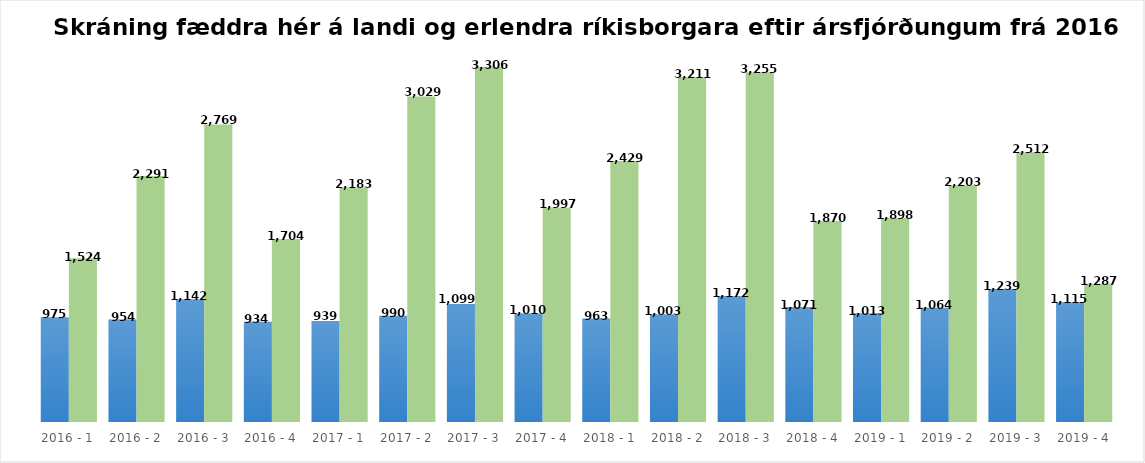
| Category | Skráning fæddra | Skráning erlendra |
|---|---|---|
| 2016 - 1 | 975 | 1524 |
| 2016 - 2 | 954 | 2291 |
| 2016 - 3 | 1142 | 2769 |
| 2016 - 4 | 934 | 1704 |
| 2017 - 1 | 939 | 2183 |
| 2017 - 2 | 990 | 3029 |
| 2017 - 3 | 1099 | 3306 |
| 2017 - 4 | 1010 | 1997 |
| 2018 - 1 | 963 | 2429 |
| 2018 - 2 | 1003 | 3211 |
| 2018 - 3 | 1172 | 3255 |
| 2018 - 4 | 1071 | 1870 |
| 2019 - 1 | 1013 | 1898 |
| 2019 - 2 | 1064 | 2203 |
| 2019 - 3 | 1239 | 2512 |
| 2019 - 4 | 1115 | 1287 |